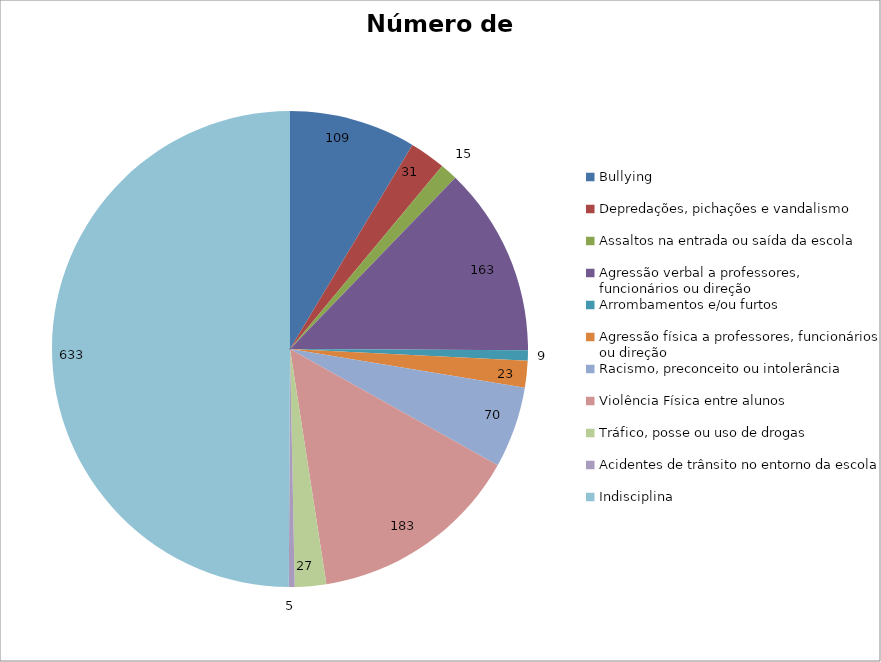
| Category | Número de Casos |
|---|---|
| Bullying | 109 |
| Depredações, pichações e vandalismo | 31 |
| Assaltos na entrada ou saída da escola | 15 |
| Agressão verbal a professores, funcionários ou direção | 163 |
| Arrombamentos e/ou furtos | 9 |
| Agressão física a professores, funcionários ou direção | 23 |
| Racismo, preconceito ou intolerância | 70 |
| Violência Física entre alunos | 183 |
| Tráfico, posse ou uso de drogas | 27 |
| Acidentes de trânsito no entorno da escola | 5 |
| Indisciplina | 633 |